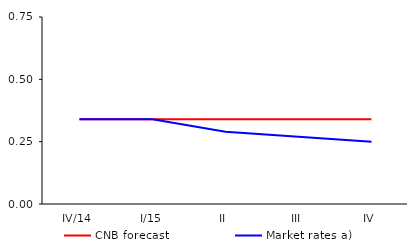
| Category | CNB forecast | Market rates a) |
|---|---|---|
| IV/14 | 0.34 | 0.34 |
| I/15 | 0.34 | 0.34 |
| II | 0.34 | 0.29 |
| III | 0.34 | 0.27 |
| IV | 0.34 | 0.25 |